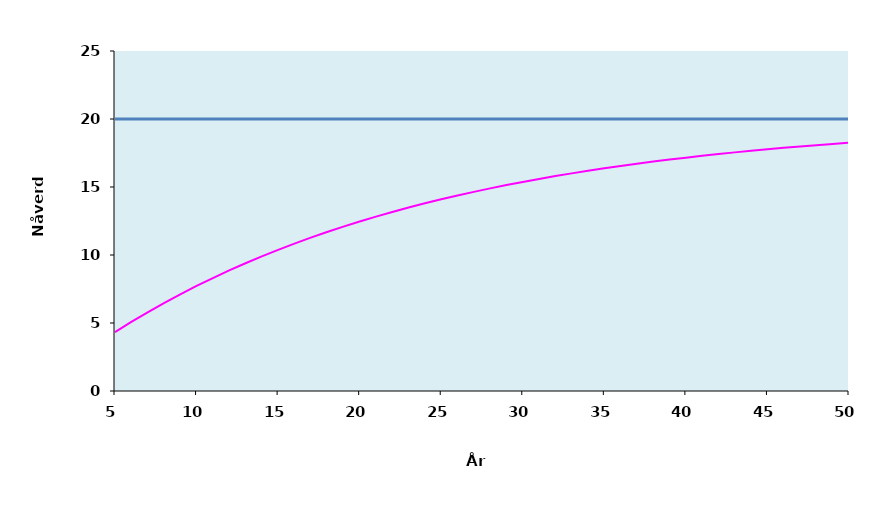
| Category | Series 1 | Series 0 |
|---|---|---|
| 5.0 | 4.329 | 20 |
| 6.0 | 5.076 | 20 |
| 7.0 | 5.786 | 20 |
| 8.0 | 6.463 | 20 |
| 9.0 | 7.108 | 20 |
| 10.0 | 7.722 | 20 |
| 11.0 | 8.306 | 20 |
| 12.0 | 8.863 | 20 |
| 13.0 | 9.394 | 20 |
| 14.0 | 9.899 | 20 |
| 15.0 | 10.38 | 20 |
| 16.0 | 10.838 | 20 |
| 17.0 | 11.274 | 20 |
| 18.0 | 11.69 | 20 |
| 19.0 | 12.085 | 20 |
| 20.0 | 12.462 | 20 |
| 21.0 | 12.821 | 20 |
| 22.0 | 13.163 | 20 |
| 23.0 | 13.489 | 20 |
| 24.0 | 13.799 | 20 |
| 25.0 | 14.094 | 20 |
| 26.0 | 14.375 | 20 |
| 27.0 | 14.643 | 20 |
| 28.0 | 14.898 | 20 |
| 29.0 | 15.141 | 20 |
| 30.0 | 15.372 | 20 |
| 31.0 | 15.593 | 20 |
| 32.0 | 15.803 | 20 |
| 33.0 | 16.003 | 20 |
| 34.0 | 16.193 | 20 |
| 35.0 | 16.374 | 20 |
| 36.0 | 16.547 | 20 |
| 37.0 | 16.711 | 20 |
| 38.0 | 16.868 | 20 |
| 39.0 | 17.017 | 20 |
| 40.0 | 17.159 | 20 |
| 41.0 | 17.294 | 20 |
| 42.0 | 17.423 | 20 |
| 43.0 | 17.546 | 20 |
| 44.0 | 17.663 | 20 |
| 45.0 | 17.774 | 20 |
| 46.0 | 17.88 | 20 |
| 47.0 | 17.981 | 20 |
| 48.0 | 18.077 | 20 |
| 49.0 | 18.169 | 20 |
| 50.0 | 18.256 | 20 |